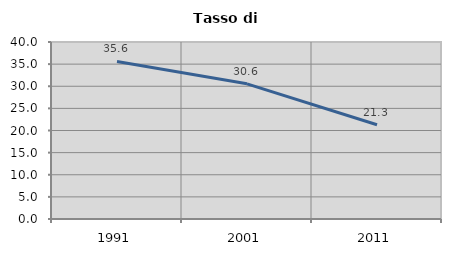
| Category | Tasso di disoccupazione   |
|---|---|
| 1991.0 | 35.601 |
| 2001.0 | 30.552 |
| 2011.0 | 21.294 |